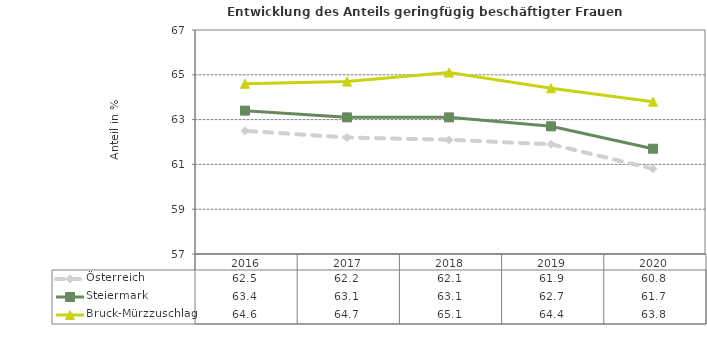
| Category | Österreich | Steiermark | Bruck-Mürzzuschlag |
|---|---|---|---|
| 2020.0 | 60.8 | 61.7 | 63.8 |
| 2019.0 | 61.9 | 62.7 | 64.4 |
| 2018.0 | 62.1 | 63.1 | 65.1 |
| 2017.0 | 62.2 | 63.1 | 64.7 |
| 2016.0 | 62.5 | 63.4 | 64.6 |